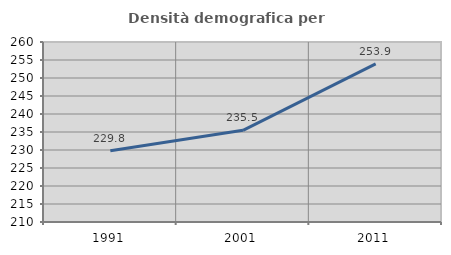
| Category | Densità demografica |
|---|---|
| 1991.0 | 229.787 |
| 2001.0 | 235.461 |
| 2011.0 | 253.937 |